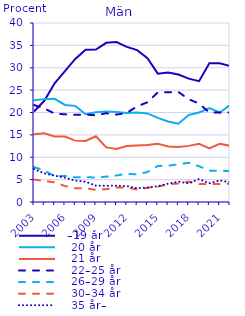
| Category |   –19 år |    20 år |    21 år |    22–25 år |    26–29 år |    30–34 år |    35 år– |
|---|---|---|---|---|---|---|---|
| 2003.0 | 20.239 | 22.747 | 15.142 | 21.678 | 7.801 | 5.016 | 7.377 |
| 2004.0 | 22.612 | 22.989 | 15.34 | 20.925 | 7.058 | 4.686 | 6.39 |
| 2005.0 | 26.512 | 23.061 | 14.643 | 19.75 | 5.747 | 4.389 | 5.896 |
| 2006.0 | 29.259 | 21.695 | 14.612 | 19.591 | 5.844 | 3.568 | 5.431 |
| 2007.0 | 31.967 | 21.484 | 13.715 | 19.469 | 5.5 | 3.078 | 4.787 |
| 2008.0 | 34.022 | 19.625 | 13.651 | 19.531 | 5.57 | 3.064 | 4.538 |
| 2009.0 | 34.078 | 20.032 | 14.699 | 19.375 | 5.451 | 2.718 | 3.647 |
| 2010.0 | 35.57 | 20.203 | 12.208 | 19.836 | 5.671 | 2.878 | 3.633 |
| 2011.0 | 35.732 | 20.105 | 11.838 | 19.528 | 5.931 | 3.215 | 3.652 |
| 2012.0 | 34.661 | 19.872 | 12.491 | 19.907 | 6.311 | 3.213 | 3.546 |
| 2013.0 | 33.929 | 20.019 | 12.606 | 21.382 | 6.176 | 2.798 | 3.09 |
| 2014.0 | 32.132 | 19.797 | 12.714 | 22.279 | 6.704 | 3.153 | 3.22 |
| 2015.0 | 28.682 | 18.791 | 13.034 | 24.49 | 8.057 | 3.428 | 3.518 |
| 2016.0 | 28.911 | 17.992 | 12.399 | 24.518 | 8.108 | 3.977 | 4.096 |
| 2017.0 | 28.5 | 17.498 | 12.303 | 24.589 | 8.439 | 4.123 | 4.549 |
| 2018.0 | 27.568 | 19.463 | 12.543 | 22.959 | 8.748 | 4.559 | 4.16 |
| 2019.0 | 27 | 20 | 13 | 22 | 8 | 4 | 5.115 |
| 2020.0 | 31 | 21 | 12 | 20 | 7 | 4 | 4.182 |
| 2021.0 | 31 | 20 | 13 | 20 | 7 | 4 | 4.84 |
| 2022.0 | 30.373 | 21.673 | 12.558 | 19.986 | 6.887 | 4.116 | 4.406 |